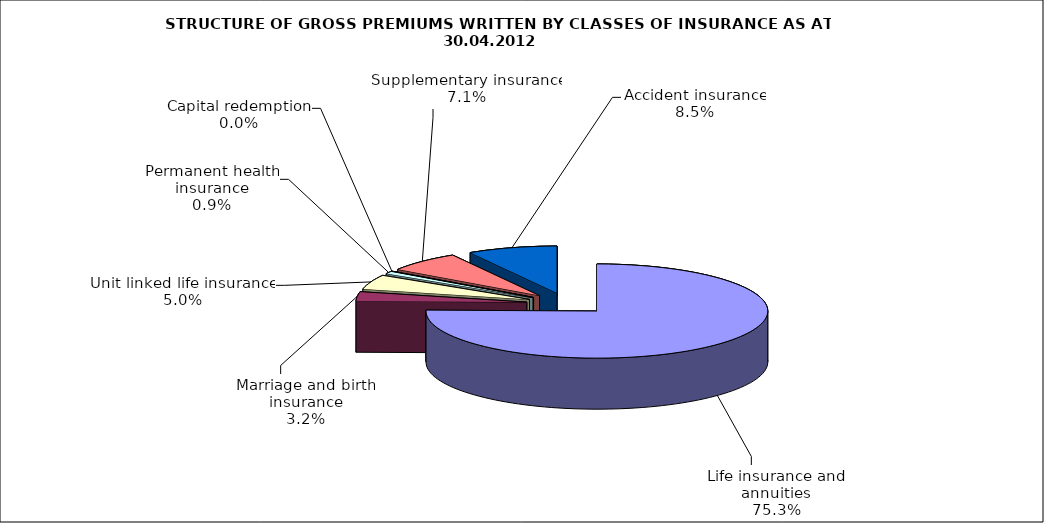
| Category | Series 0 |
|---|---|
| Life insurance and annuities | 63009451.718 |
| Marriage and birth insurance | 2713002.152 |
| Unit linked life insurance | 4174803.082 |
| Permanent health insurance | 730446.76 |
| Capital redemption | 0 |
| Supplementary insurance | 5924996.038 |
| Accident insurance | 7101292.83 |